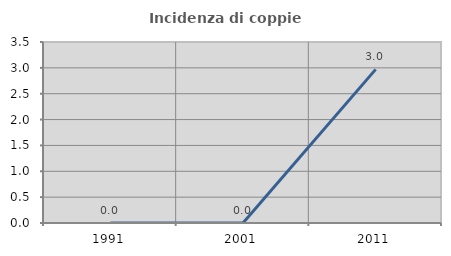
| Category | Incidenza di coppie miste |
|---|---|
| 1991.0 | 0 |
| 2001.0 | 0 |
| 2011.0 | 2.97 |